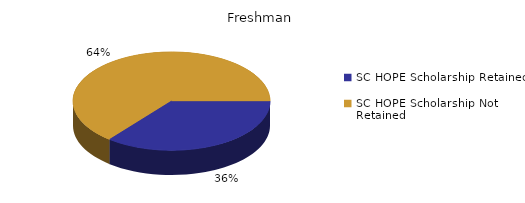
| Category | Freshman |
|---|---|
| SC HOPE Scholarship Retained  | 39 |
| SC HOPE Scholarship Not Retained  | 70 |